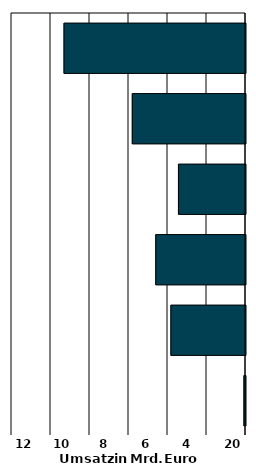
| Category | Series 0 |
|---|---|
| 0 | -0.08 |
| 1 | -3.826 |
| 2 | -4.602 |
| 3 | -3.438 |
| 4 | -5.806 |
| 5 | -9.307 |